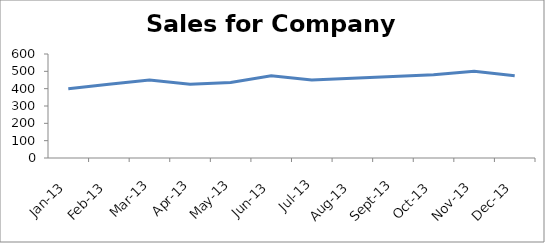
| Category | Sales |
|---|---|
| 2013-01-01 | 400 |
| 2013-02-01 | 425 |
| 2013-03-01 | 450 |
| 2013-04-01 | 425 |
| 2013-05-01 | 435 |
| 2013-06-01 | 475 |
| 2013-07-01 | 450 |
| 2013-08-01 | 460 |
| 2013-09-01 | 470 |
| 2013-10-01 | 480 |
| 2013-11-01 | 500 |
| 2013-12-01 | 475 |